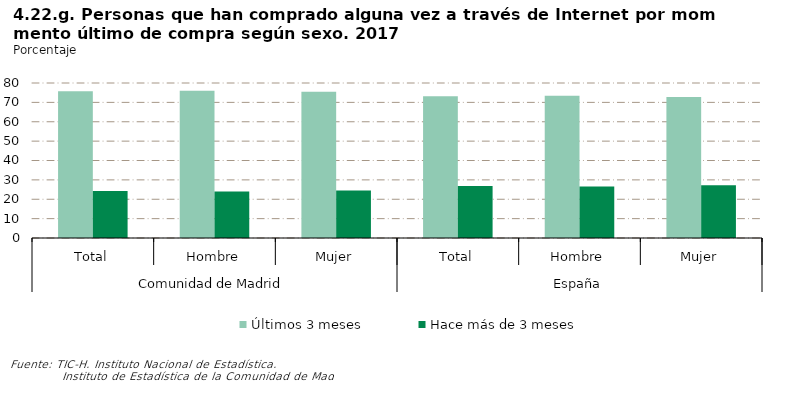
| Category | Últimos 3 meses | Hace más de 3 meses |
|---|---|---|
| 0 | 75.732 | 24.268 |
| 1 | 75.987 | 24.013 |
| 2 | 75.485 | 24.515 |
| 3 | 73.133 | 26.867 |
| 4 | 73.47 | 26.53 |
| 5 | 72.763 | 27.237 |